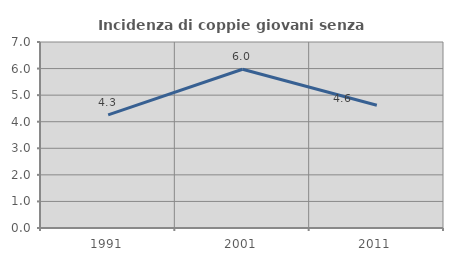
| Category | Incidenza di coppie giovani senza figli |
|---|---|
| 1991.0 | 4.255 |
| 2001.0 | 5.974 |
| 2011.0 | 4.621 |